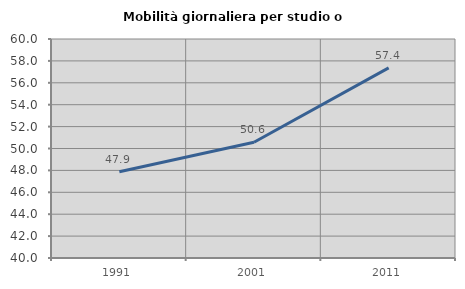
| Category | Mobilità giornaliera per studio o lavoro |
|---|---|
| 1991.0 | 47.876 |
| 2001.0 | 50.567 |
| 2011.0 | 57.368 |